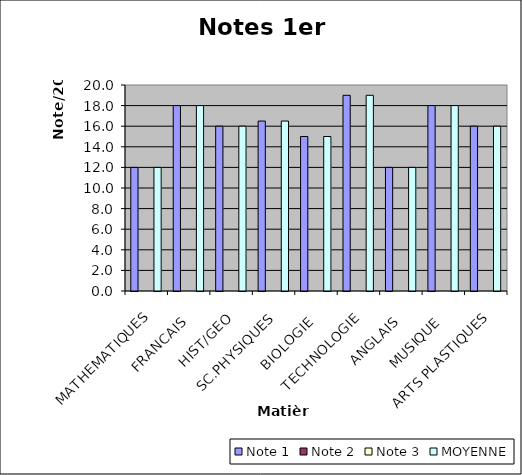
| Category | Note 1 | Note 2 | Note 3 | MOYENNE |
|---|---|---|---|---|
| MATHEMATIQUES | 12 |  |  | 12 |
| FRANCAIS | 18 |  |  | 18 |
| HIST/GEO | 16 |  |  | 16 |
| SC.PHYSIQUES | 16.5 |  |  | 16.5 |
| BIOLOGIE | 15 |  |  | 15 |
| TECHNOLOGIE | 19 |  |  | 19 |
| ANGLAIS | 12 |  |  | 12 |
| MUSIQUE | 18 |  |  | 18 |
| ARTS PLASTIQUES | 16 |  |  | 16 |